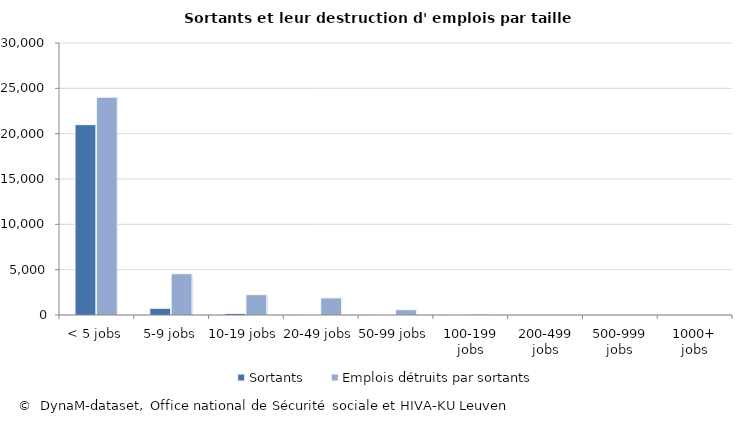
| Category | Sortants | Emplois détruits par sortants |
|---|---|---|
| < 5 jobs | 20997 | 24019 |
| 5-9 jobs | 738 | 4551 |
| 10-19 jobs | 176 | 2242 |
| 20-49 jobs | 67 | 1885 |
| 50-99 jobs | 8 | 587 |
| 100-199 jobs | 1 | 106 |
| 200-499 jobs | 0 | 0 |
| 500-999 jobs | 0 | 0 |
| 1000+ jobs | 0 | 0 |